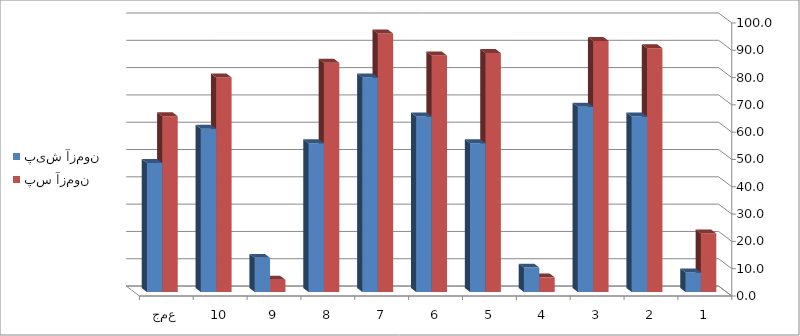
| Category | پیش آزمون | پس آزمون |
|---|---|---|
| 1 | 7.143 | 21.429 |
| 2 | 64.286 | 89.286 |
| 3 | 67.857 | 91.964 |
| 4 | 8.929 | 5.357 |
| 5 | 54.464 | 87.5 |
| 6 | 64.286 | 86.607 |
| 7 | 78.571 | 94.643 |
| 8 | 54.464 | 83.929 |
| 9 | 12.5 | 4.464 |
| 10 | 59.821 | 78.571 |
| جمع | 47.232 | 64.375 |